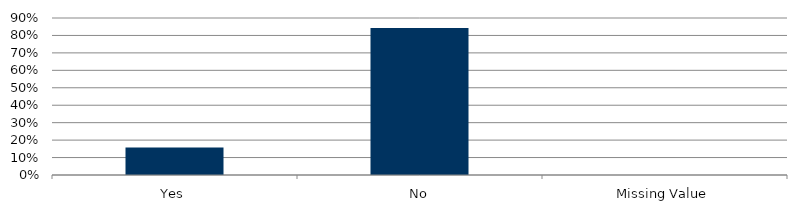
| Category | Total |
|---|---|
| Yes | 0.157 |
| No | 0.843 |
| Missing Value | 0 |